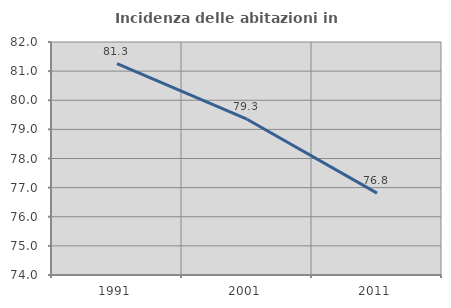
| Category | Incidenza delle abitazioni in proprietà  |
|---|---|
| 1991.0 | 81.26 |
| 2001.0 | 79.348 |
| 2011.0 | 76.812 |